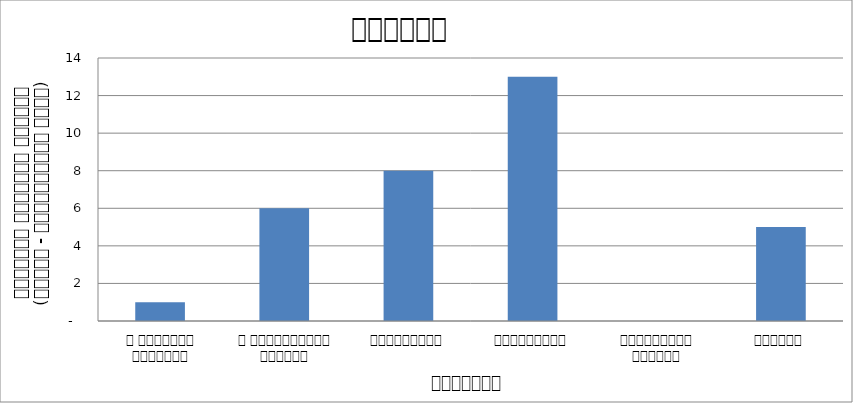
| Category | शिक्षा |
|---|---|
| द हिमालयन टाइम्स् | 1 |
| द काठमाण्डौं पोस्ट् | 6 |
| रिपब्लिका | 8 |
| कान्तिपुर | 13 |
| अन्नपूर्ण पोस्ट् | 0 |
| नागरिक | 5 |